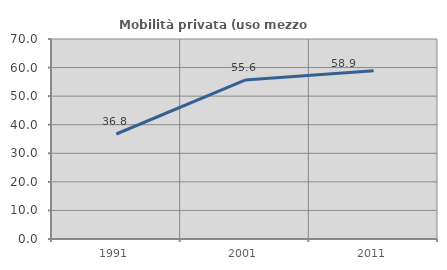
| Category | Mobilità privata (uso mezzo privato) |
|---|---|
| 1991.0 | 36.751 |
| 2001.0 | 55.635 |
| 2011.0 | 58.898 |